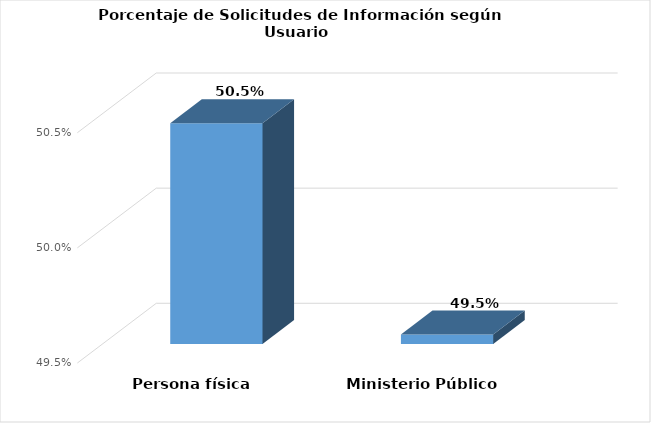
| Category | Series 0 |
|---|---|
| Persona física | 0.505 |
| Ministerio Público | 0.495 |